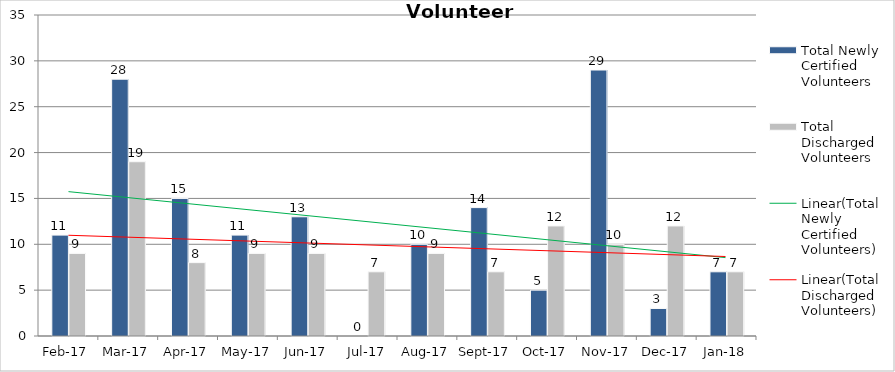
| Category | Total Newly Certified Volunteers | Total Discharged Volunteers |
|---|---|---|
| 2017-02-01 | 11 | 9 |
| 2017-03-01 | 28 | 19 |
| 2017-04-01 | 15 | 8 |
| 2017-05-01 | 11 | 9 |
| 2017-06-01 | 13 | 9 |
| 2017-07-01 | 0 | 7 |
| 2017-08-01 | 10 | 9 |
| 2017-09-01 | 14 | 7 |
| 2017-10-01 | 5 | 12 |
| 2017-11-01 | 29 | 10 |
| 2017-12-01 | 3 | 12 |
| 2018-01-01 | 7 | 7 |